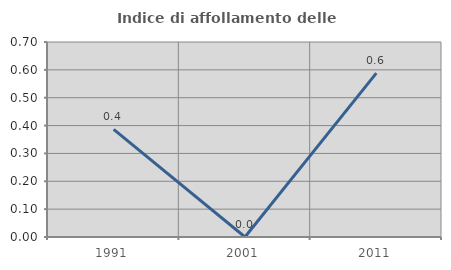
| Category | Indice di affollamento delle abitazioni  |
|---|---|
| 1991.0 | 0.386 |
| 2001.0 | 0 |
| 2011.0 | 0.588 |